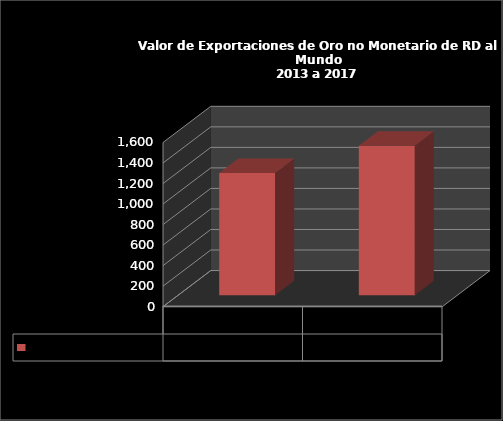
| Category | Exportaciones |
|---|---|
| 2013.0 | 1190.6 |
| 2017.0 | 1456.7 |